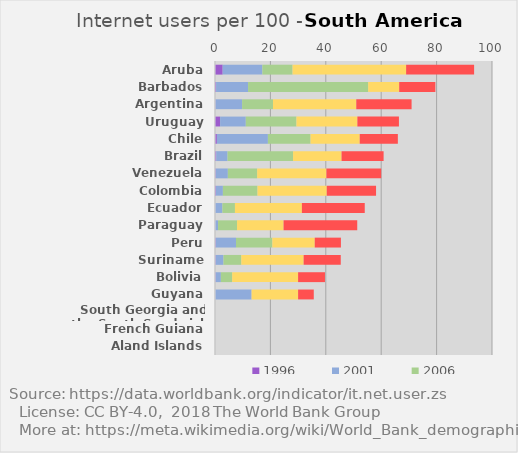
| Category | 1996 | 2001 | 2006 | 2011 | 2016 |
|---|---|---|---|---|---|
| Aruba | 2.77 | 14.33 | 10.9 | 41 | 24.54 |
| Barbados | 0.39 | 11.55 | 43.36 | 11.2 | 13.05 |
| Argentina | 0.14 | 9.64 | 11.15 | 30.07 | 19.97 |
| Uruguay | 1.85 | 9.27 | 18.28 | 22 | 15 |
| Chile | 0.68 | 18.42 | 15.4 | 17.75 | 13.76 |
| Brazil | 0.45 | 4.08 | 23.65 | 17.51 | 15.18 |
| Venezuela | 0.25 | 4.39 | 10.58 | 25 | 19.78 |
| Colombia | 0.33 | 2.52 | 12.49 | 25.01 | 17.79 |
| Ecuador | 0.09 | 2.58 | 4.53 | 24.17 | 22.69 |
| Paraguay | 0.02 | 1.08 | 6.86 | 16.8 | 26.59 |
| Peru | 0.25 | 7.33 | 13.12 | 15.31 | 9.45 |
| Suriname | 0.23 | 2.83 | 6.44 | 22.5 | 13.4 |
| Bolivia | 0.2 | 1.92 | 4.08 | 23.8 | 9.7 |
| Guyana | 0.07 | 13.14 | 0 | 16.79 | 5.66 |
| South Georgia and the South Sandwich Islands | 0 | 0 | 0 | 0 | 0 |
| French Guiana | 0 | 0 | 0 | 0 | 0 |
| Aland Islands | 0 | 0 | 0 | 0 | 0 |